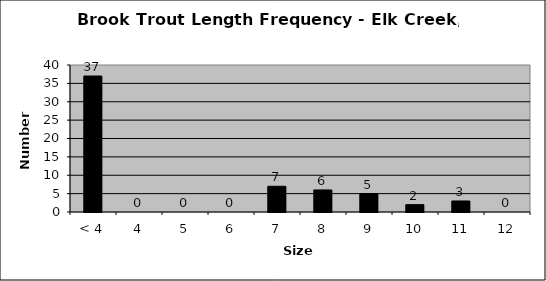
| Category | Series 0 |
|---|---|
| < 4 | 37 |
| 4 | 0 |
| 5 | 0 |
| 6 | 0 |
| 7 | 7 |
| 8 | 6 |
| 9 | 5 |
| 10 | 2 |
| 11 | 3 |
| 12 | 0 |